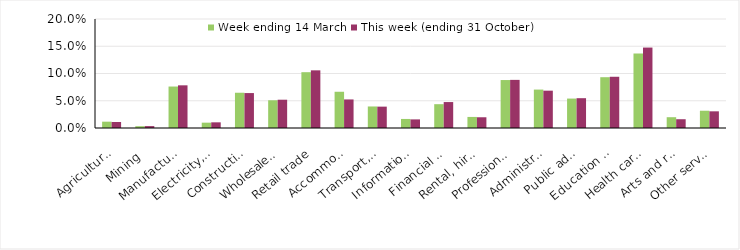
| Category | Week ending 14 March | This week (ending 31 October) |
|---|---|---|
| Agriculture, forestry and fishing | 0.012 | 0.011 |
| Mining | 0.003 | 0.004 |
| Manufacturing | 0.076 | 0.078 |
| Electricity, gas, water and waste services | 0.01 | 0.01 |
| Construction | 0.065 | 0.064 |
| Wholesale trade | 0.051 | 0.052 |
| Retail trade | 0.102 | 0.106 |
| Accommodation and food services | 0.066 | 0.052 |
| Transport, postal and warehousing | 0.04 | 0.039 |
| Information media and telecommunications | 0.017 | 0.016 |
| Financial and insurance services | 0.044 | 0.048 |
| Rental, hiring and real estate services | 0.02 | 0.02 |
| Professional, scientific and technical services | 0.088 | 0.088 |
| Administrative and support services | 0.07 | 0.068 |
| Public administration and safety | 0.054 | 0.055 |
| Education and training | 0.093 | 0.094 |
| Health care and social assistance | 0.137 | 0.148 |
| Arts and recreation services | 0.02 | 0.016 |
| Other services | 0.032 | 0.031 |